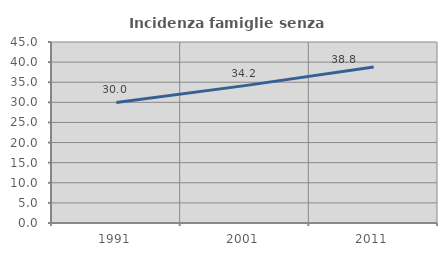
| Category | Incidenza famiglie senza nuclei |
|---|---|
| 1991.0 | 29.981 |
| 2001.0 | 34.156 |
| 2011.0 | 38.793 |